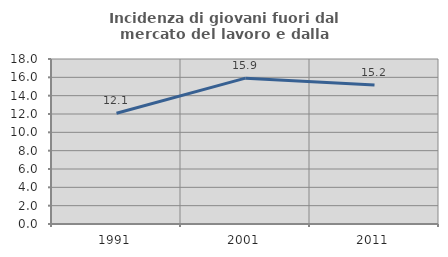
| Category | Incidenza di giovani fuori dal mercato del lavoro e dalla formazione  |
|---|---|
| 1991.0 | 12.081 |
| 2001.0 | 15.909 |
| 2011.0 | 15.169 |